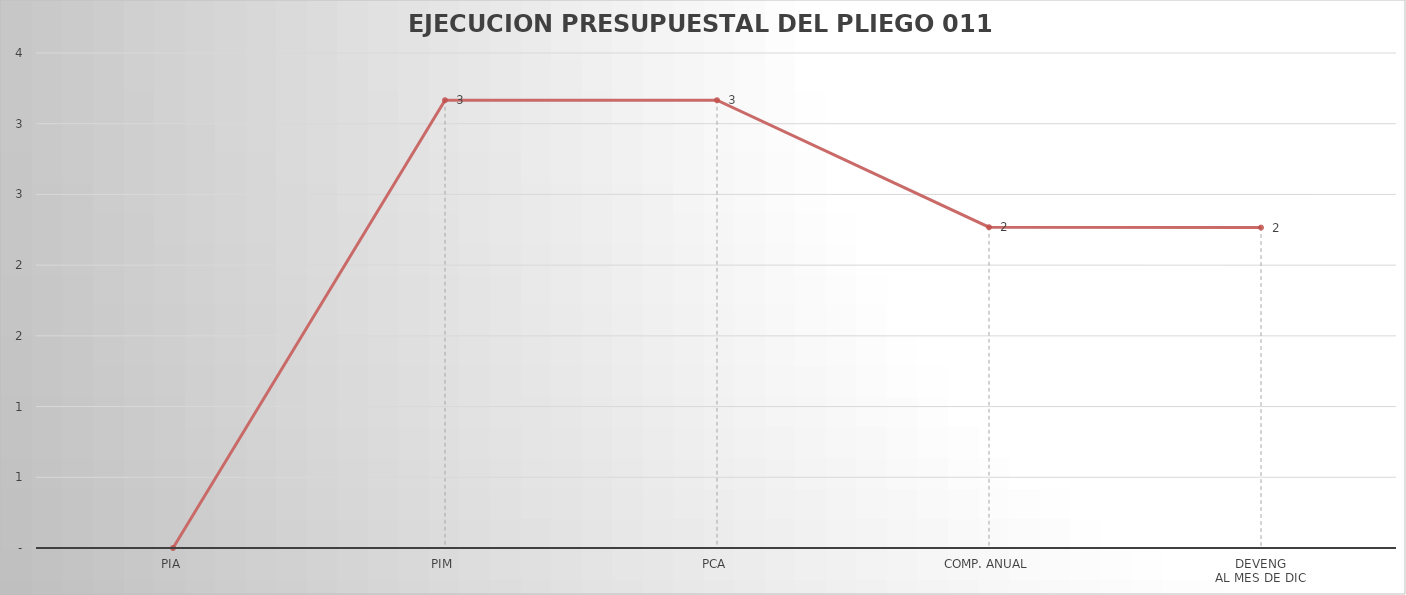
| Category | Series 0 |
|---|---|
| PIA | 0 |
| PIM | 3.166 |
| PCA | 3.166 |
| COMP. ANUAL | 2.268 |
| DEVENG
AL MES DE DIC | 2.266 |